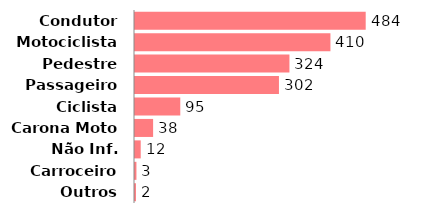
| Category | Qtde |
|---|---|
| Condutor | 484 |
| Motociclista | 410 |
| Pedestre | 324 |
| Passageiro | 302 |
| Ciclista | 95 |
| Carona Moto | 38 |
| Não Inf. | 12 |
| Carroceiro | 3 |
| Outros | 2 |